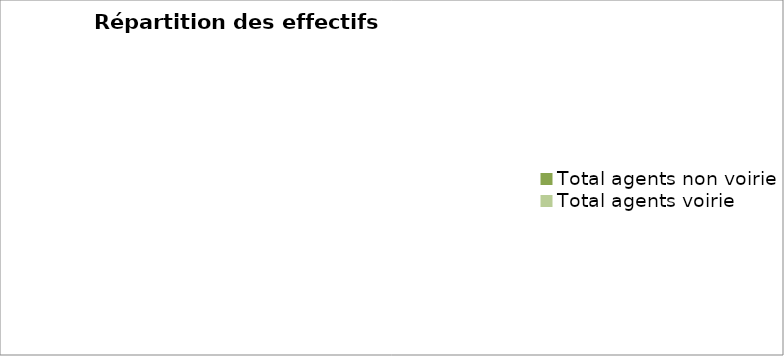
| Category | Series 0 |
|---|---|
| Total agents non voirie | 0 |
| Total agents voirie | 0 |